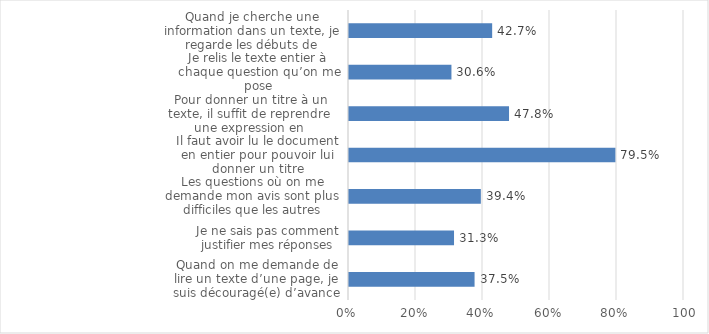
| Category | Series 0 |
|---|---|
| Quand on me demande de lire un texte d’une page, je suis découragé(e) d’avance | 0.375 |
| Je ne sais pas comment justifier mes réponses | 0.313 |
| Les questions où on me demande mon avis sont plus difficiles que les autres | 0.394 |
| Il faut avoir lu le document en entier pour pouvoir lui donner un titre | 0.795 |
| Pour donner un titre à un texte, il suffit de reprendre une expression en introduction ou en conclusion | 0.478 |
| Je relis le texte entier à chaque question qu’on me pose | 0.306 |
| Quand je cherche une information dans un texte, je regarde les débuts de paragraphe pour aller plus vite | 0.427 |